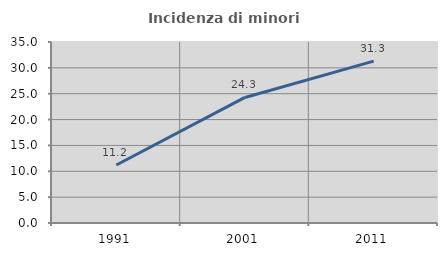
| Category | Incidenza di minori stranieri |
|---|---|
| 1991.0 | 11.224 |
| 2001.0 | 24.277 |
| 2011.0 | 31.307 |